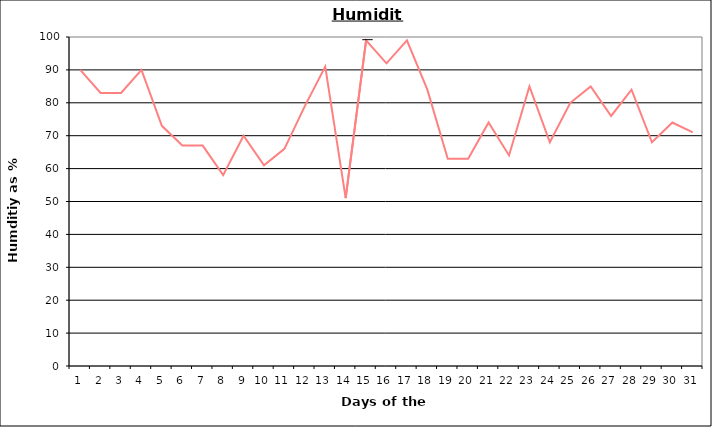
| Category | Series 0 |
|---|---|
| 0 | 90 |
| 1 | 83 |
| 2 | 83 |
| 3 | 90 |
| 4 | 73 |
| 5 | 67 |
| 6 | 67 |
| 7 | 58 |
| 8 | 70 |
| 9 | 61 |
| 10 | 66 |
| 11 | 79 |
| 12 | 91 |
| 13 | 51 |
| 14 | 99 |
| 15 | 92 |
| 16 | 99 |
| 17 | 84 |
| 18 | 63 |
| 19 | 63 |
| 20 | 74 |
| 21 | 64 |
| 22 | 85 |
| 23 | 68 |
| 24 | 80 |
| 25 | 85 |
| 26 | 76 |
| 27 | 84 |
| 28 | 68 |
| 29 | 74 |
| 30 | 71 |